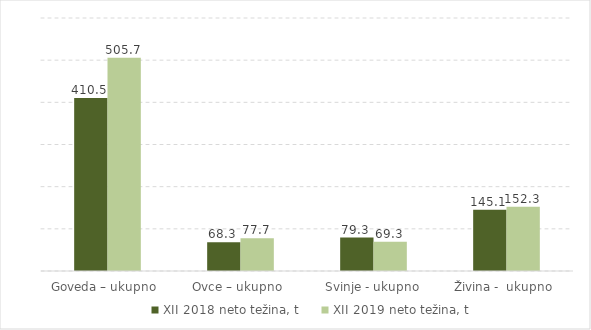
| Category | XII 2018 | XII 2019 |
|---|---|---|
| Goveda – ukupno  | 410.5 | 505.7 |
| Ovce – ukupno  | 68.3 | 77.7 |
| Svinje - ukupno | 79.3 | 69.3 |
| Živina -  ukupno  | 145.1 | 152.3 |